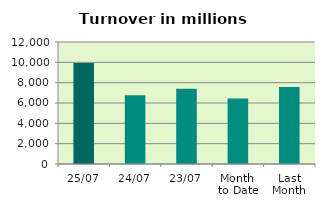
| Category | Series 0 |
|---|---|
| 25/07 | 9946.084 |
| 24/07 | 6761.526 |
| 23/07 | 7412.889 |
| Month 
to Date | 6447.606 |
| Last
Month | 7579.876 |